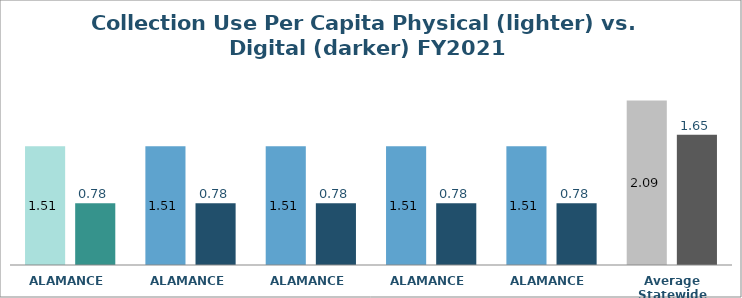
| Category | Physical | Digital |
|---|---|---|
| ALAMANCE  | 1.507 | 0.784 |
| ALAMANCE  | 1.507 | 0.784 |
| ALAMANCE  | 1.507 | 0.784 |
| ALAMANCE  | 1.507 | 0.784 |
| ALAMANCE  | 1.507 | 0.784 |
| Average Statewide | 2.087 | 1.652 |